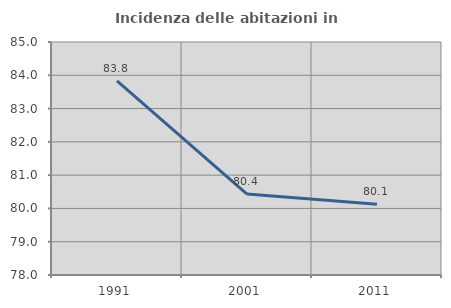
| Category | Incidenza delle abitazioni in proprietà  |
|---|---|
| 1991.0 | 83.83 |
| 2001.0 | 80.43 |
| 2011.0 | 80.127 |